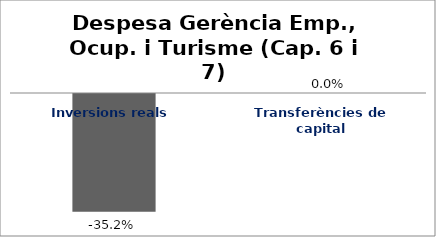
| Category | Series 0 |
|---|---|
| Inversions reals | -0.352 |
| Transferències de capital | 0 |